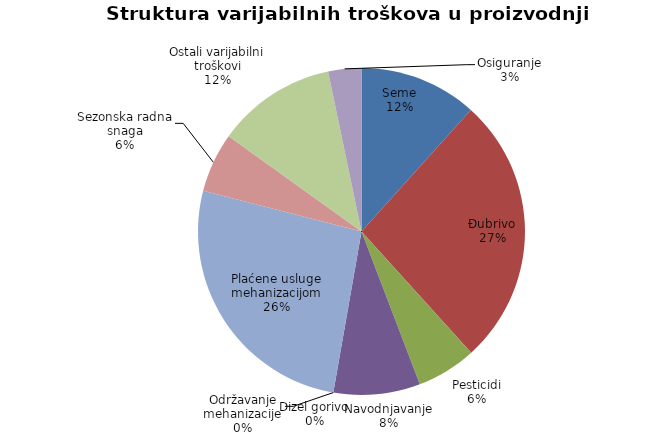
| Category | Series 0 |
|---|---|
| Seme | 8880 |
| Đubrivo | 20300 |
| Pesticidi | 4500 |
| Navodnjavanje | 6525 |
| Dizel gorivo | 0 |
| Održavanje mehanizacije | 0 |
| Plaćene usluge mehanizacijom | 20000 |
| Sezonska radna snaga | 4500 |
| Ostali varijabilni troškovi | 9000 |
| Osiguranje | 2500 |